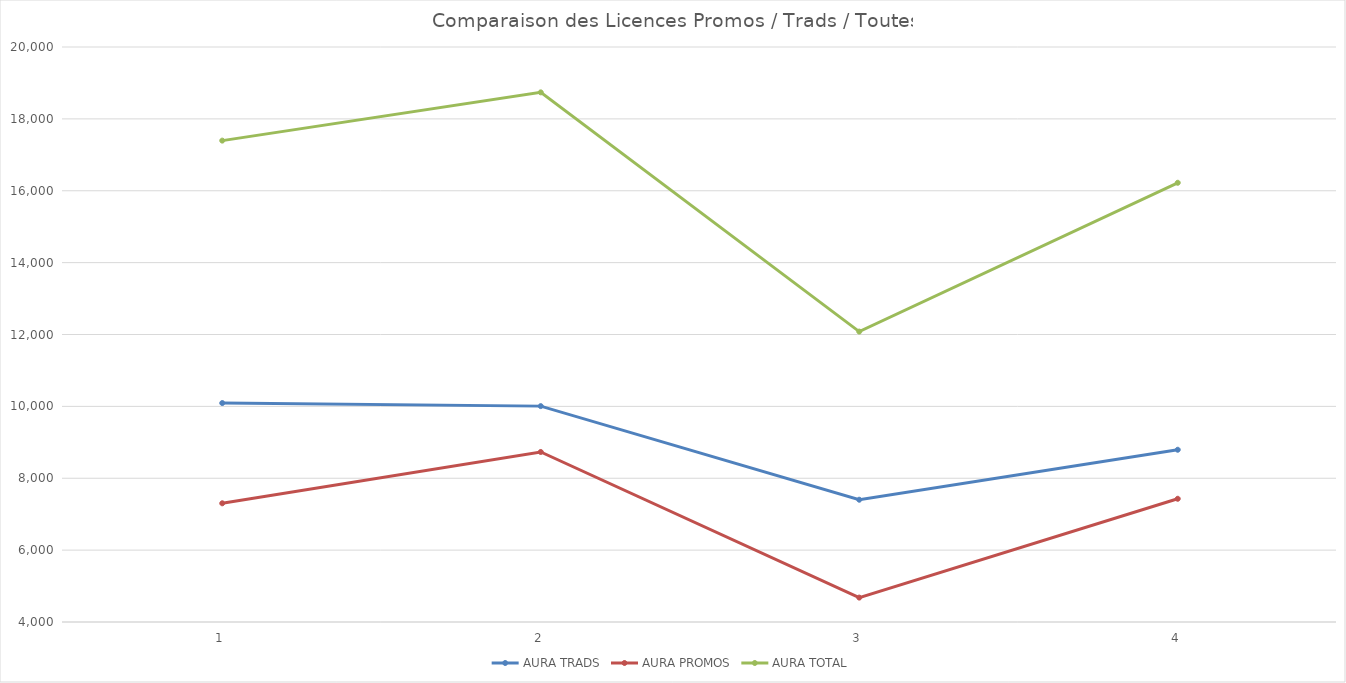
| Category | AURA TRADS | AURA PROMOS | AURA TOTAL |
|---|---|---|---|
| 0 | 10092 | 7303 | 17395 |
| 1 | 10007 | 8731 | 18738 |
| 2 | 7402 | 4679 | 12081 |
| 3 | 8793 | 7429 | 16222 |